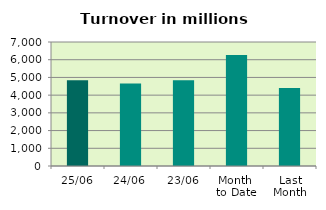
| Category | Series 0 |
|---|---|
| 25/06 | 4842.747 |
| 24/06 | 4659.829 |
| 23/06 | 4835.693 |
| Month 
to Date | 6260.801 |
| Last
Month | 4406.275 |